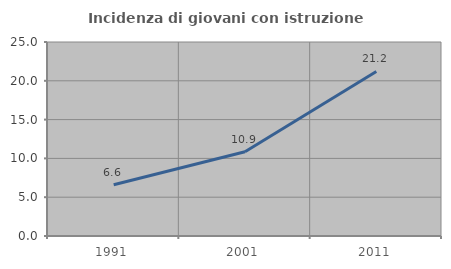
| Category | Incidenza di giovani con istruzione universitaria |
|---|---|
| 1991.0 | 6.608 |
| 2001.0 | 10.859 |
| 2011.0 | 21.208 |